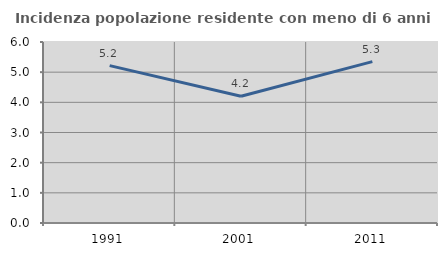
| Category | Incidenza popolazione residente con meno di 6 anni |
|---|---|
| 1991.0 | 5.218 |
| 2001.0 | 4.201 |
| 2011.0 | 5.349 |